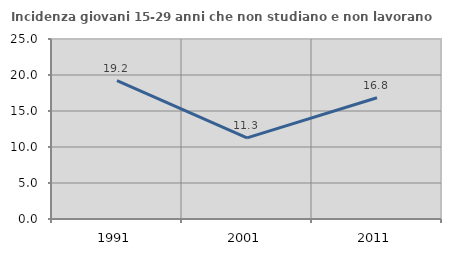
| Category | Incidenza giovani 15-29 anni che non studiano e non lavorano  |
|---|---|
| 1991.0 | 19.231 |
| 2001.0 | 11.26 |
| 2011.0 | 16.844 |